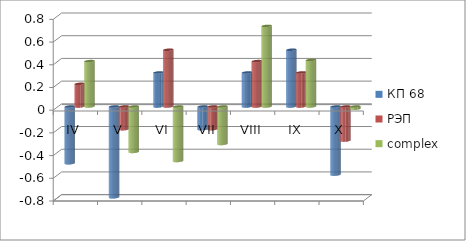
| Category | КП 68 | РЭП  | complex |
|---|---|---|---|
| IV | -0.5 | 0.2 | 0.4 |
| V | -0.8 | -0.2 | -0.4 |
| VI | 0.3 | 0.5 | -0.48 |
| VII | -0.2 | -0.2 | -0.33 |
| VIII | 0.3 | 0.4 | 0.71 |
| IX | 0.5 | 0.3 | 0.41 |
| X | -0.6 | -0.3 | -0.02 |